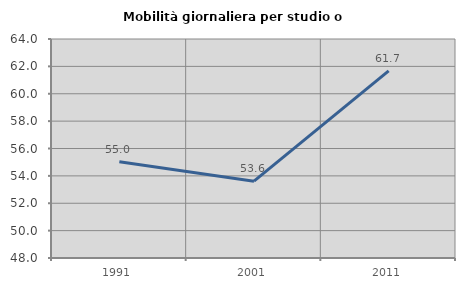
| Category | Mobilità giornaliera per studio o lavoro |
|---|---|
| 1991.0 | 55.028 |
| 2001.0 | 53.614 |
| 2011.0 | 61.672 |